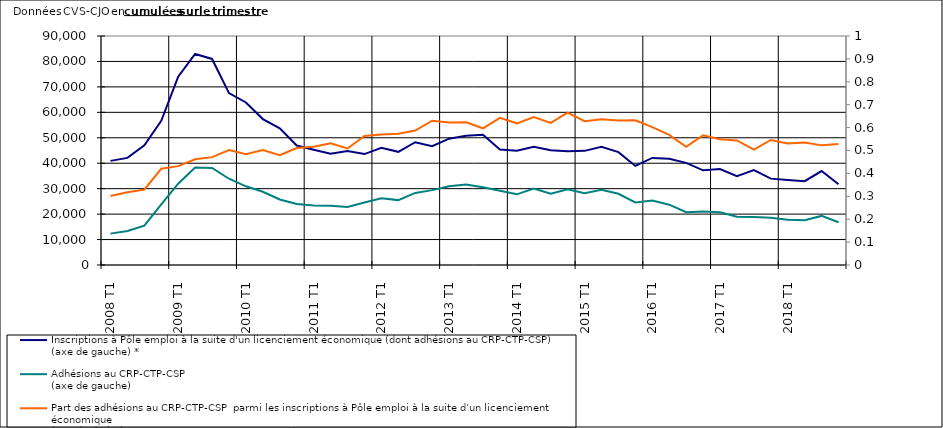
| Category | Inscriptions à Pôle emploi à la suite d'un licenciement économique (dont adhésions au CRP-CTP-CSP) 
(axe de gauche) * | Adhésions au CRP-CTP-CSP 
(axe de gauche) |
|---|---|---|
| 2008 T1 | 40924 | 12327 |
| 2008 T2 | 42090 | 13358 |
| 2008 T3 | 47035 | 15477 |
| 2008 T4 | 56634 | 23801 |
| 2009 T1 | 74014 | 31950 |
| 2009 T2 | 82943 | 38309 |
| 2009 T3 | 80982 | 38150 |
| 2009 T4 | 67568 | 33908 |
| 2010 T1 | 63865 | 30924 |
| 2010 T2 | 57351 | 28780 |
| 2010 T3 | 53704 | 25745 |
| 2010 T4 | 46938 | 23970 |
| 2011 T1 | 45298 | 23411 |
| 2011 T2 | 43715 | 23252 |
| 2011 T3 | 44769 | 22777 |
| 2011 T4 | 43596 | 24570 |
| 2012 T1 | 46053 | 26247 |
| 2012 T2 | 44477 | 25501 |
| 2012 T3 | 48250 | 28332 |
| 2012 T4 | 46697 | 29428 |
| 2013 T1 | 49659 | 30927 |
| 2013 T2 | 50825 | 31658 |
| 2013 T3 | 51215 | 30574 |
| 2013 T4 | 45358 | 29156 |
| 2014 T1 | 44896 | 27776 |
| 2014 T2 | 46450 | 30028 |
| 2014 T3 | 45104 | 28003 |
| 2014 T4 | 44703 | 29765 |
| 2015 T1 | 44853 | 28177 |
| 2015 T2 | 46415 | 29526 |
| 2015 T3 | 44365 | 27994 |
| 2015 T4 | 38930 | 24612 |
| 2016 T1 | 42089 | 25337 |
| 2016 T2 | 41740 | 23717 |
| 2016 T3 | 40140 | 20732 |
| 2016 T4 | 37210 | 21071 |
| 2017 T1 | 37689 | 20705 |
| 2017 T2 | 34872 | 18970 |
| 2017 T3 | 37315 | 18817 |
| 2017 T4 | 33942 | 18532 |
| 2018 T1 | 33450 | 17745 |
| 2018 T2 | 32926 | 17599 |
| 2018 T3 | 36931 | 19294 |
| 2018 T4 | 31762 | 16795 |